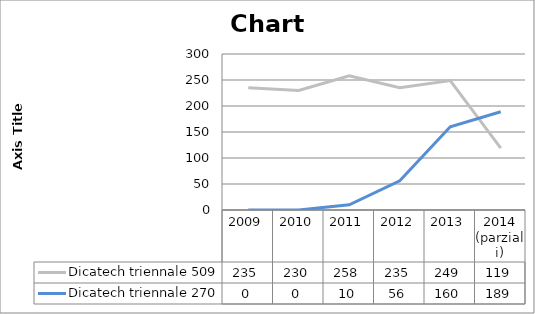
| Category | Dicatech triennale 509 | Dicatech triennale 270 |
|---|---|---|
| 2009 | 235 | 0 |
| 2010 | 230 | 0 |
| 2011 | 258 | 10 |
| 2012 | 235 | 56 |
| 2013 | 249 | 160 |
| 2014
(parziali) | 119 | 189 |